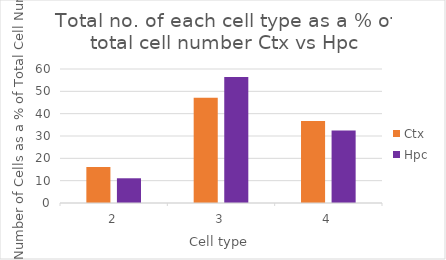
| Category | Ctx | Hpc |
|---|---|---|
| 2.0 | 16.154 | 11.071 |
| 3.0 | 47.179 | 56.429 |
| 4.0 | 36.667 | 32.5 |